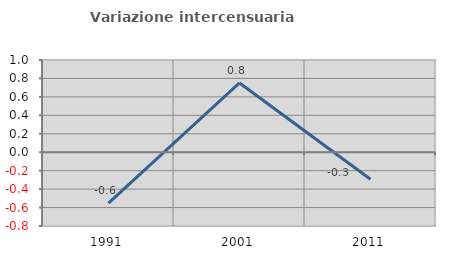
| Category | Variazione intercensuaria annua |
|---|---|
| 1991.0 | -0.553 |
| 2001.0 | 0.751 |
| 2011.0 | -0.292 |